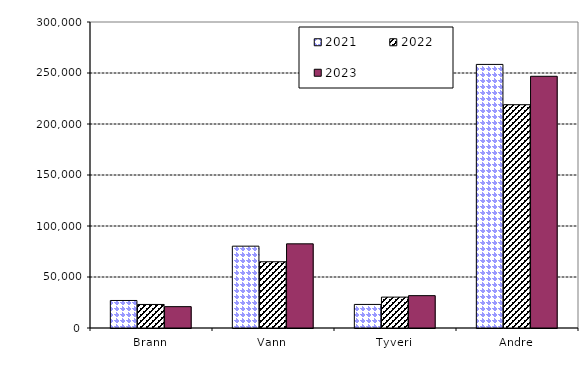
| Category | 2021 | 2022 | 2023 |
|---|---|---|---|
| Brann | 26988.177 | 23072.145 | 20936.837 |
| Vann | 80225.35 | 64941.458 | 82514.969 |
| Tyveri | 23104.743 | 30272.806 | 31715.474 |
| Andre | 258418.53 | 218923.658 | 246779.683 |